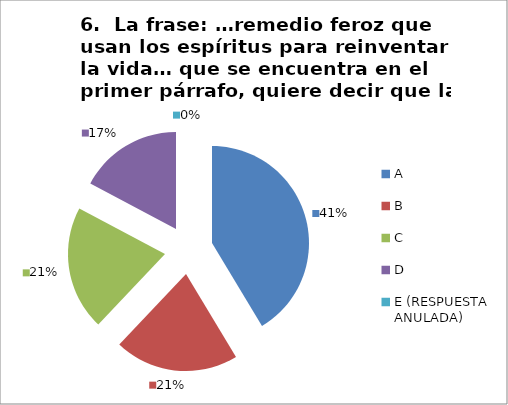
| Category | CANTIDAD DE RESPUESTAS PREGUNTA (6) | PORCENTAJE |
|---|---|---|
| A | 12 | 0.414 |
| B | 6 | 0.207 |
| C | 6 | 0.207 |
| D | 5 | 0.172 |
| E (RESPUESTA ANULADA) | 0 | 0 |